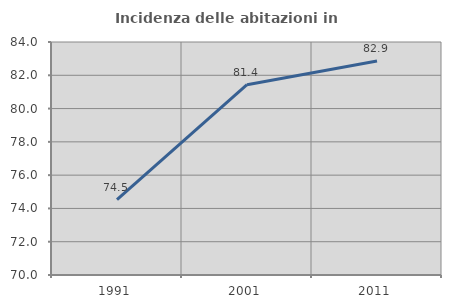
| Category | Incidenza delle abitazioni in proprietà  |
|---|---|
| 1991.0 | 74.533 |
| 2001.0 | 81.435 |
| 2011.0 | 82.853 |